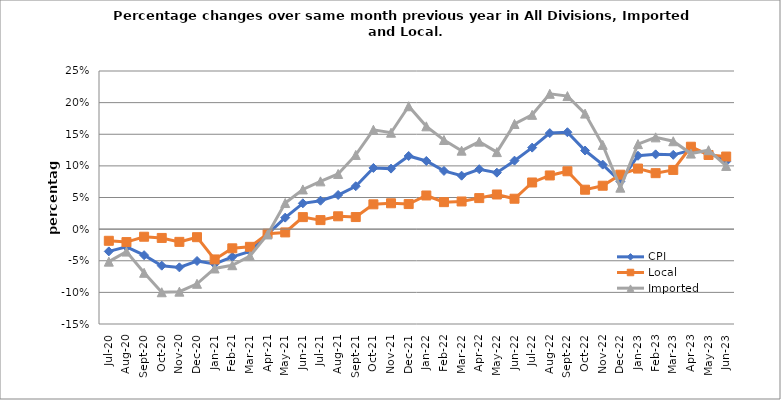
| Category | CPI | Local | Imported |
|---|---|---|---|
| 2020-07-01 | -0.035 | -0.018 | -0.051 |
| 2020-08-01 | -0.028 | -0.02 | -0.036 |
| 2020-09-01 | -0.041 | -0.012 | -0.069 |
| 2020-10-01 | -0.058 | -0.014 | -0.1 |
| 2020-11-01 | -0.06 | -0.02 | -0.099 |
| 2020-12-01 | -0.05 | -0.013 | -0.086 |
| 2021-01-01 | -0.055 | -0.048 | -0.062 |
| 2021-02-01 | -0.044 | -0.03 | -0.057 |
| 2021-03-01 | -0.035 | -0.028 | -0.043 |
| 2021-04-01 | -0.008 | -0.007 | -0.008 |
| 2021-05-01 | 0.018 | -0.005 | 0.041 |
| 2021-06-01 | 0.041 | 0.019 | 0.063 |
| 2021-07-01 | 0.045 | 0.014 | 0.075 |
| 2021-08-01 | 0.054 | 0.02 | 0.087 |
| 2021-09-01 | 0.068 | 0.019 | 0.117 |
| 2021-10-01 | 0.097 | 0.039 | 0.157 |
| 2021-11-01 | 0.096 | 0.041 | 0.152 |
| 2021-12-01 | 0.116 | 0.04 | 0.194 |
| 2022-01-01 | 0.108 | 0.053 | 0.163 |
| 2022-02-01 | 0.092 | 0.043 | 0.141 |
| 2022-03-01 | 0.085 | 0.044 | 0.124 |
| 2022-04-01 | 0.095 | 0.049 | 0.138 |
| 2022-05-01 | 0.089 | 0.055 | 0.122 |
| 2022-06-01 | 0.108 | 0.048 | 0.166 |
| 2022-07-01 | 0.129 | 0.074 | 0.181 |
| 2022-08-01 | 0.152 | 0.085 | 0.214 |
| 2022-09-01 | 0.153 | 0.091 | 0.21 |
| 2022-10-01 | 0.124 | 0.062 | 0.183 |
| 2022-11-01 | 0.102 | 0.069 | 0.133 |
| 2022-12-01 | 0.075 | 0.086 | 0.066 |
| 2023-01-01 | 0.116 | 0.096 | 0.134 |
| 2023-02-01 | 0.118 | 0.088 | 0.145 |
| 2023-03-01 | 0.117 | 0.094 | 0.139 |
| 2023-04-01 | 0.124 | 0.13 | 0.119 |
| 2023-05-01 | 0.121 | 0.117 | 0.125 |
| 2023-06-01 | 0.107 | 0.115 | 0.1 |